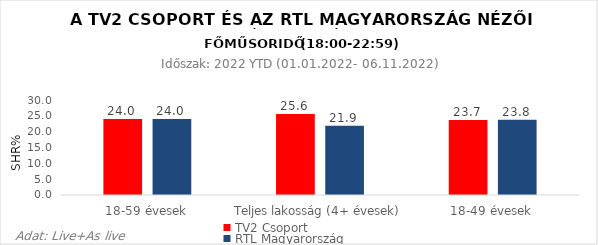
| Category | TV2 Csoport | RTL Magyarország |
|---|---|---|
| 18-59 évesek | 24 | 24 |
| Teljes lakosság (4+ évesek) | 25.6 | 21.9 |
| 18-49 évesek | 23.7 | 23.8 |